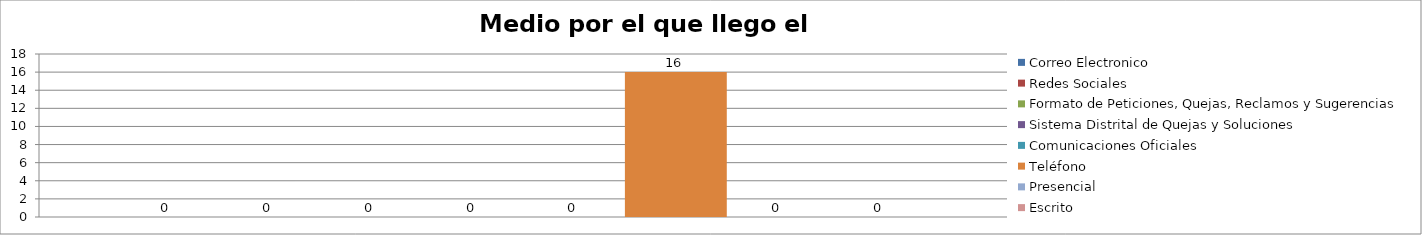
| Category | Correo Electronico | Redes Sociales | Formato de Peticiones, Quejas, Reclamos y Sugerencias | Sistema Distrital de Quejas y Soluciones  | Comunicaciones Oficiales | Teléfono | Presencial | Escrito  |
|---|---|---|---|---|---|---|---|---|
| 0 | 0 | 0 | 0 | 0 | 0 | 16 | 0 | 0 |